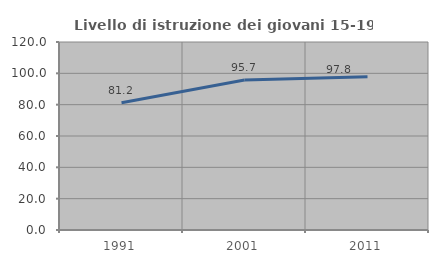
| Category | Livello di istruzione dei giovani 15-19 anni |
|---|---|
| 1991.0 | 81.188 |
| 2001.0 | 95.729 |
| 2011.0 | 97.826 |